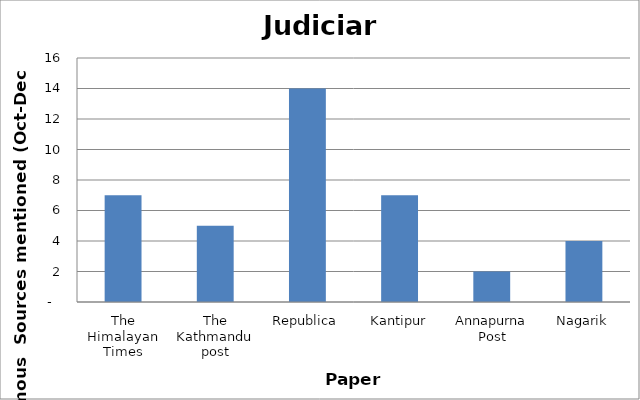
| Category | Judiciary |
|---|---|
| The Himalayan Times | 7 |
| The Kathmandu post | 5 |
| Republica | 14 |
| Kantipur | 7 |
| Annapurna Post | 2 |
| Nagarik | 4 |